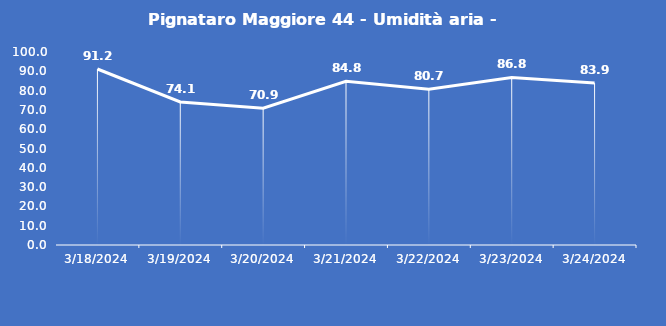
| Category | Pignataro Maggiore 44 - Umidità aria - Grezzo (%) |
|---|---|
| 3/18/24 | 91.2 |
| 3/19/24 | 74.1 |
| 3/20/24 | 70.9 |
| 3/21/24 | 84.8 |
| 3/22/24 | 80.7 |
| 3/23/24 | 86.8 |
| 3/24/24 | 83.9 |